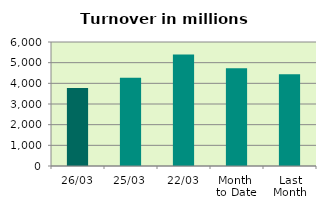
| Category | Series 0 |
|---|---|
| 26/03 | 3768.26 |
| 25/03 | 4272.531 |
| 22/03 | 5395.926 |
| Month 
to Date | 4734.238 |
| Last
Month | 4438.793 |